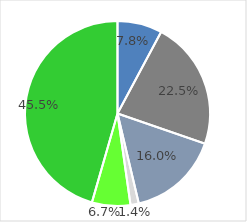
| Category | Series 0 |
|---|---|
| Kernenergie | 0.078 |
| Kohle | 0.225 |
| Erdgas | 0.16 |
| Sonstige fossile Energieträger | 0.014 |
| Sonstige erneuerbare Energien | 0.067 |
| Erneuerbare Energien, _x000d_gefördert nach dem EEG | 0.455 |